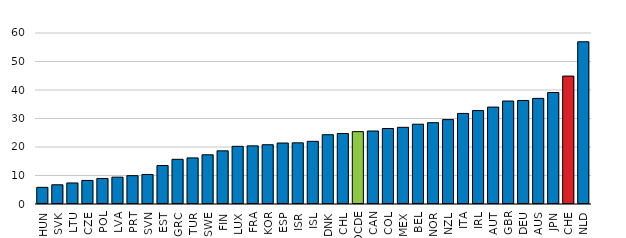
| Category | Women | Series 1 |
|---|---|---|
| HUN | 5.841 |  |
| SVK | 6.747 |  |
| LTU | 7.383 |  |
| CZE | 8.272 |  |
| POL | 8.959 |  |
| LVA | 9.424 |  |
| PRT | 9.944 |  |
| SVN | 10.361 |  |
| EST | 13.504 |  |
| GRC | 15.683 |  |
| TUR | 16.17 |  |
| SWE | 17.269 |  |
| FIN | 18.657 |  |
| LUX | 20.236 |  |
| FRA | 20.402 |  |
| KOR | 20.794 |  |
| ESP | 21.396 |  |
| ISR | 21.468 |  |
| ISL | 21.988 |  |
| DNK | 24.31 |  |
| CHL | 24.722 |  |
| OCDE | 25.391 |  |
| CAN | 25.613 |  |
| COL | 26.488 |  |
| MEX | 26.905 |  |
| BEL | 27.994 |  |
| NOR | 28.53 |  |
| NZL | 29.615 |  |
| ITA | 31.777 |  |
| IRL | 32.784 |  |
| AUT | 34.007 |  |
| GBR | 36.133 |  |
| DEU | 36.33 |  |
| AUS | 37.057 |  |
| JPN | 39.12 |  |
| CHE | 44.883 |  |
| NLD | 56.921 |  |